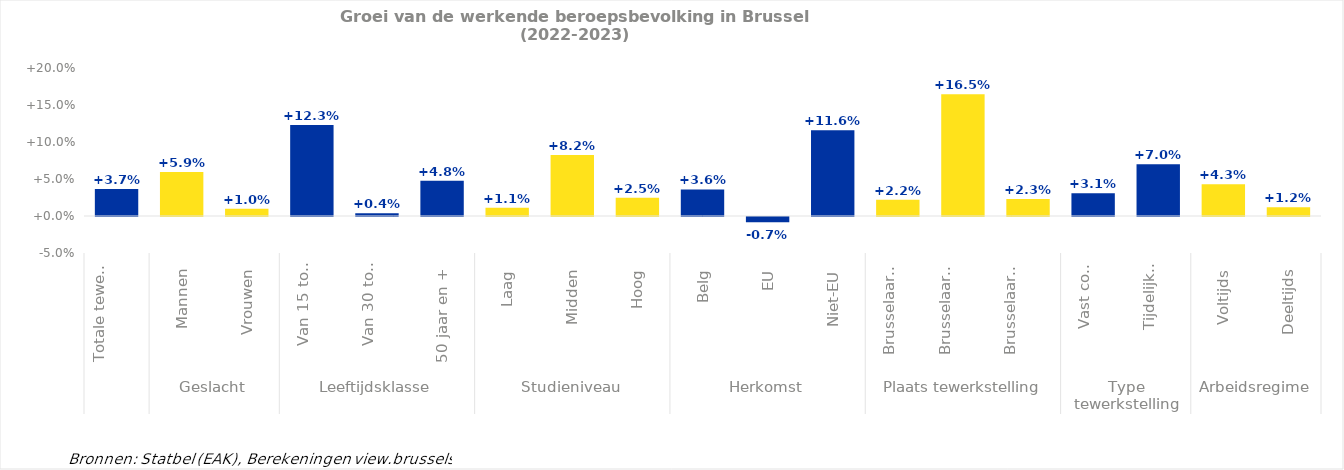
| Category | % |
|---|---|
| 0 | 0.037 |
| 1 | 0.059 |
| 2 | 0.01 |
| 3 | 0.123 |
| 4 | 0.004 |
| 5 | 0.048 |
| 6 | 0.011 |
| 7 | 0.082 |
| 8 | 0.025 |
| 9 | 0.036 |
| 10 | -0.007 |
| 11 | 0.116 |
| 12 | 0.022 |
| 13 | 0.165 |
| 14 | 0.023 |
| 15 | 0.031 |
| 16 | 0.07 |
| 17 | 0.043 |
| 18 | 0.012 |